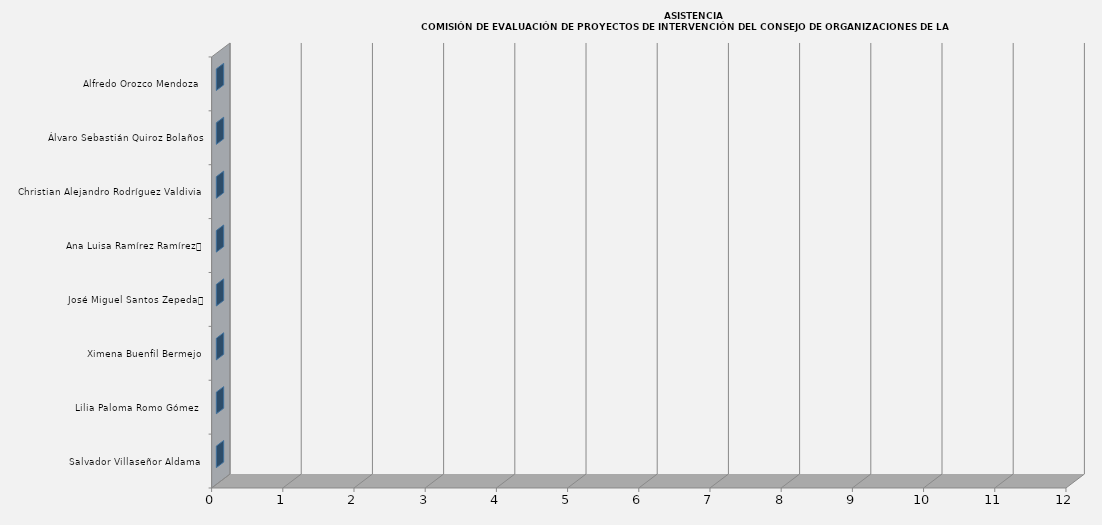
| Category | Series 0 |
|---|---|
| Salvador Villaseñor Aldama  | 0 |
| Lilia Paloma Romo Gómez  | 0 |
| Ximena Buenfil Bermejo | 0 |
| José Miguel Santos Zepeda	 | 0 |
| Ana Luisa Ramírez Ramírez	 | 0 |
| Christian Alejandro Rodríguez Valdivia  | 0 |
| Álvaro Sebastián Quiroz Bolaños | 0 |
| Alfredo Orozco Mendoza  | 0 |